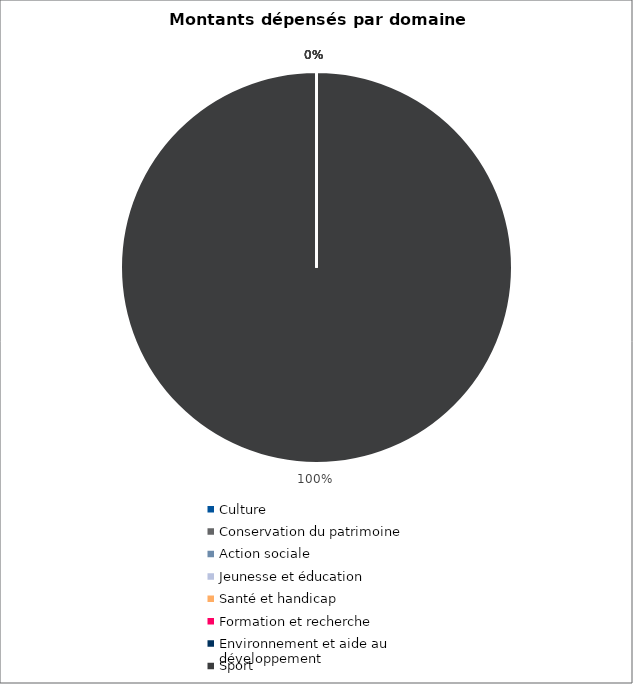
| Category | Series 0 |
|---|---|
| Culture | 0 |
| Conservation du patrimoine | 0 |
| Action sociale | 0 |
| Jeunesse et éducation | 0 |
| Santé et handicap | 0 |
| Formation et recherche | 0 |
| Environnement et aide au
développement | 0 |
| Sport | 3030914.65 |
| Autres projets d’utilité publique | 0 |